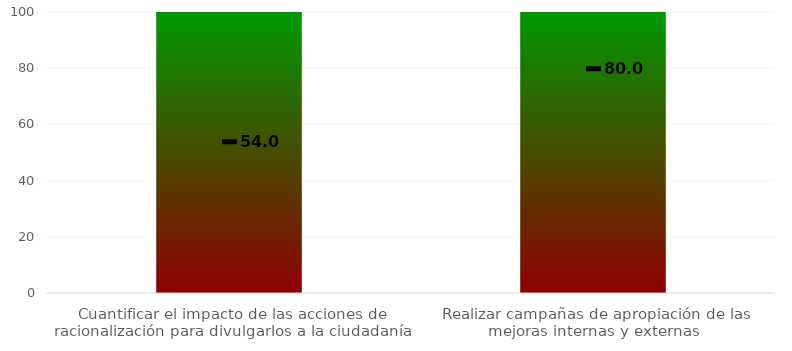
| Category | Niveles |
|---|---|
| Cuantificar el impacto de las acciones de racionalización para divulgarlos a la ciudadanía | 100 |
| Realizar campañas de apropiación de las mejoras internas y externas  | 100 |